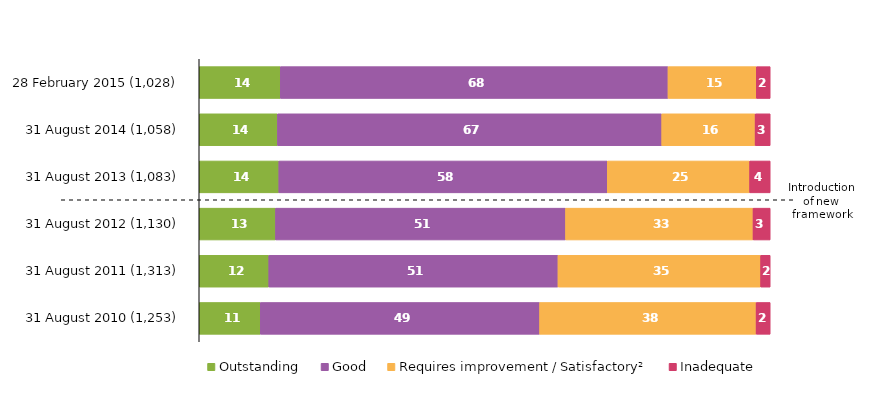
| Category | Outstanding | Good | Requires improvement / Satisfactory² | Inadequate |
|---|---|---|---|---|
| 28 February 2015 (1,028) | 14.202 | 67.899 | 15.467 | 2.432 |
| 31 August 2014 (1,058) | 13.705 | 67.297 | 16.352 | 2.647 |
| 31 August 2013 (1,083) | 13.943 | 57.525 | 24.931 | 3.601 |
| 31 August 2012 (1,130) | 13.363 | 50.796 | 32.832 | 3.009 |
| 31 August 2011 (1,313) | 12.186 | 50.647 | 35.491 | 1.676 |
| 31 August 2010 (1,253) | 10.694 | 48.923 | 37.909 | 2.474 |